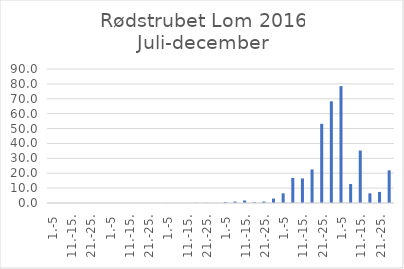
| Category | Series 0 |
|---|---|
| 1.-5 | 0 |
| 6.-10. | 0 |
| 11.-15. | 0 |
| 16.-20. | 0 |
| 21.-25. | 0 |
| 26.-31. | 0 |
| 1.-5 | 0 |
| 6.-10. | 0 |
| 11.-15. | 0 |
| 16.-20. | 0 |
| 21.-25. | 0 |
| 26.-31. | 0 |
| 1.-5 | 0.064 |
| 6.-10. | 0.035 |
| 11.-15. | 0 |
| 16.-20. | 0.14 |
| 21.-25. | 0.16 |
| 26.-30. | 0.065 |
| 1.-5 | 0.62 |
| 6.-10. | 0.964 |
| 11.-15. | 1.694 |
| 16.-20. | 0.531 |
| 21.-25. | 0.974 |
| 26.-31. | 2.985 |
| 1.-5 | 6.491 |
| 6.-10. | 16.869 |
| 11.-15. | 16.515 |
| 16.-20. | 22.553 |
| 21.-25. | 53.195 |
| 26.-30. | 68.31 |
| 1.-5 | 78.495 |
| 6.-10. | 12.778 |
| 11.-15. | 35.236 |
| 16.-20. | 6.505 |
| 21.-25. | 7.438 |
| 26.-31. | 21.945 |